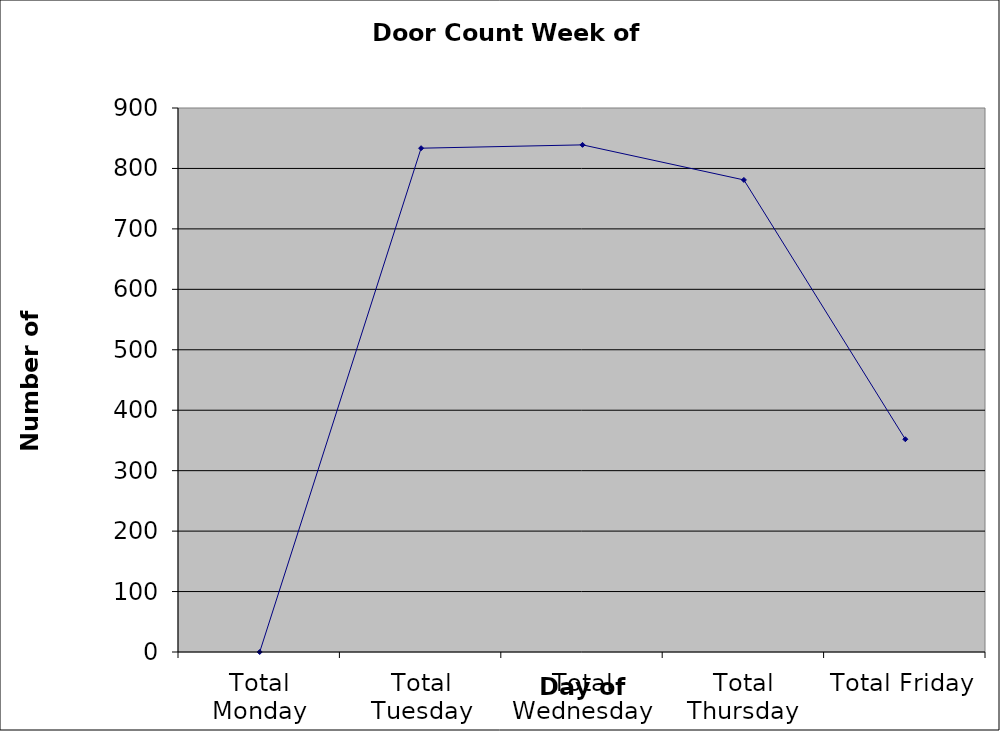
| Category | Series 0 |
|---|---|
| Total Monday | 0 |
| Total Tuesday | 833.5 |
| Total Wednesday | 839 |
| Total Thursday | 781 |
| Total Friday | 352 |